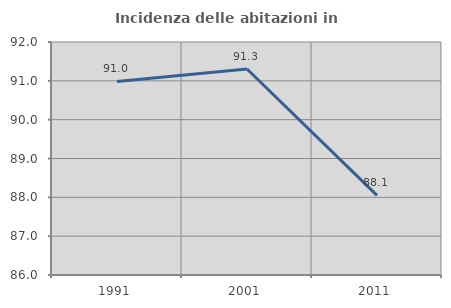
| Category | Incidenza delle abitazioni in proprietà  |
|---|---|
| 1991.0 | 90.984 |
| 2001.0 | 91.304 |
| 2011.0 | 88.05 |